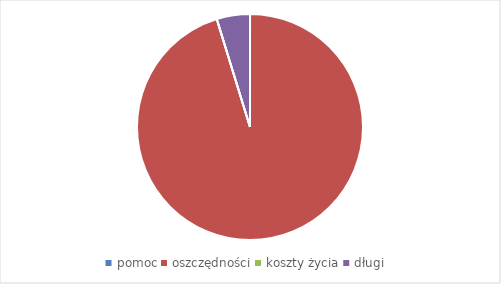
| Category | Series 0 |
|---|---|
| pomoc | 0 |
| oszczędności | 0.741 |
| koszty życia | 0 |
| długi | 0.037 |